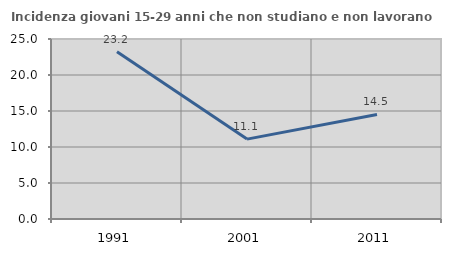
| Category | Incidenza giovani 15-29 anni che non studiano e non lavorano  |
|---|---|
| 1991.0 | 23.235 |
| 2001.0 | 11.097 |
| 2011.0 | 14.517 |